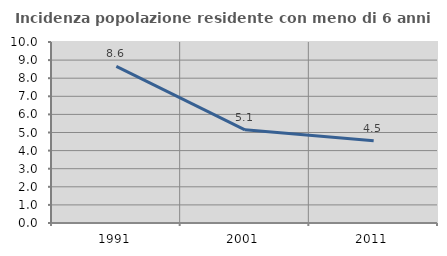
| Category | Incidenza popolazione residente con meno di 6 anni |
|---|---|
| 1991.0 | 8.65 |
| 2001.0 | 5.149 |
| 2011.0 | 4.546 |